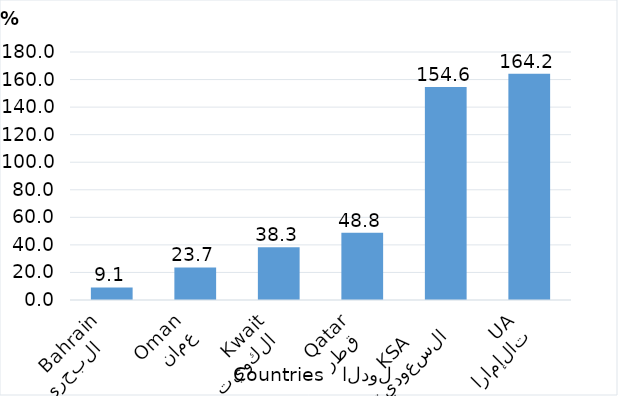
| Category | Series 0 |
|---|---|
| الإمارات
UAE | 164.151 |
| السعودية
KSA      | 154.617 |
| قطر 
 Qatar | 48.775 |
| الكويت 
    Kwait | 38.252 |
| عمان
 Oman | 23.663 |
| البحرين   
 Bahrain | 9.086 |